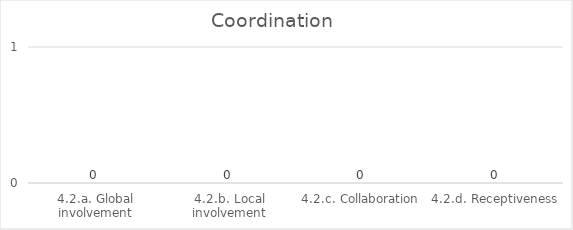
| Category | Coordination |
|---|---|
| 4.2.a. Global involvement | 0 |
| 4.2.b. Local involvement | 0 |
| 4.2.c. Collaboration | 0 |
| 4.2.d. Receptiveness | 0 |